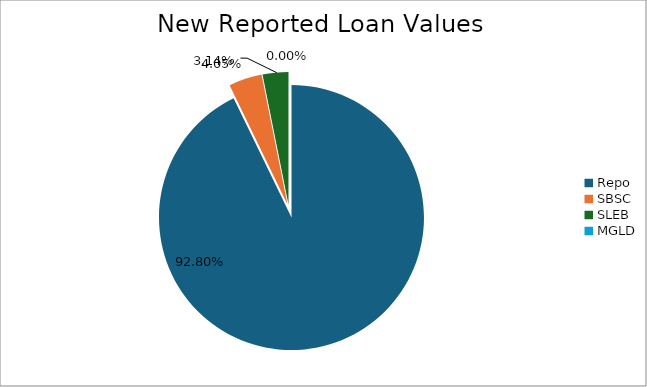
| Category | Series 0 |
|---|---|
| Repo | 12777915.268 |
| SBSC | 558115.475 |
| SLEB | 432413.7 |
| MGLD | 157.581 |